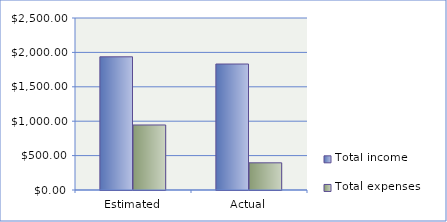
| Category | Total income | Total expenses |
|---|---|---|
| Estimated | 1936 | 945 |
| Actual | 1831 | 395 |